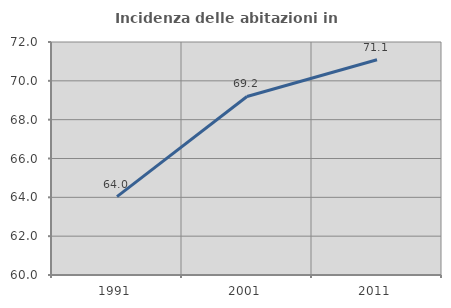
| Category | Incidenza delle abitazioni in proprietà  |
|---|---|
| 1991.0 | 64.039 |
| 2001.0 | 69.195 |
| 2011.0 | 71.085 |